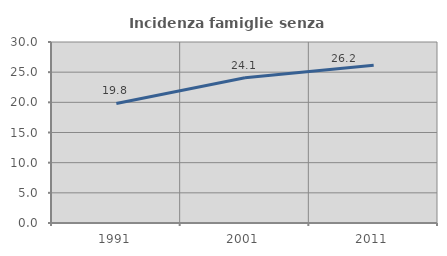
| Category | Incidenza famiglie senza nuclei |
|---|---|
| 1991.0 | 19.822 |
| 2001.0 | 24.085 |
| 2011.0 | 26.164 |